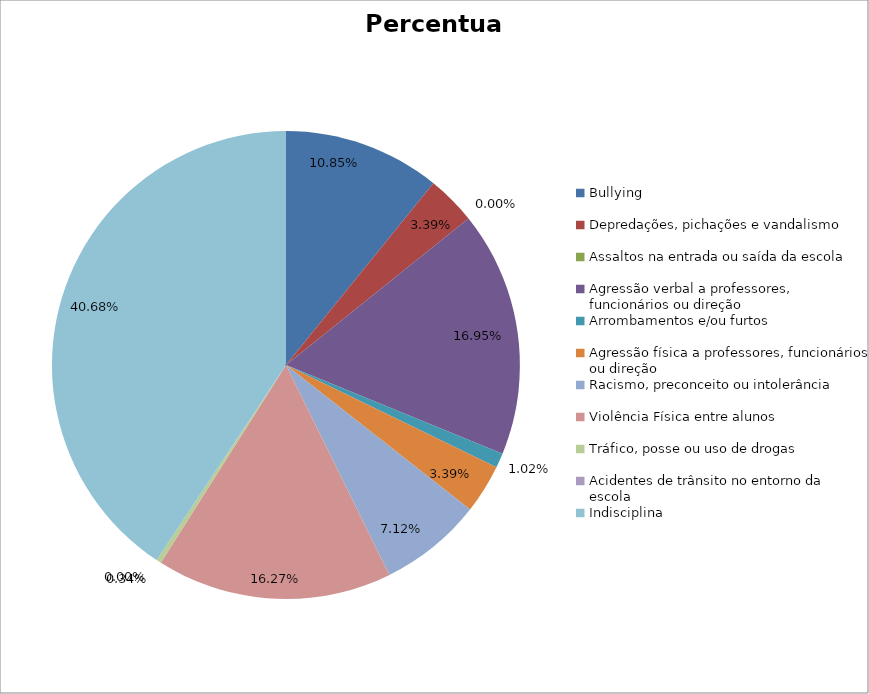
| Category | Percentual |
|---|---|
| Bullying | 0.108 |
| Depredações, pichações e vandalismo | 0.034 |
| Assaltos na entrada ou saída da escola | 0 |
| Agressão verbal a professores, funcionários ou direção | 0.169 |
| Arrombamentos e/ou furtos | 0.01 |
| Agressão física a professores, funcionários ou direção | 0.034 |
| Racismo, preconceito ou intolerância | 0.071 |
| Violência Física entre alunos | 0.163 |
| Tráfico, posse ou uso de drogas | 0.003 |
| Acidentes de trânsito no entorno da escola | 0 |
| Indisciplina | 0.407 |